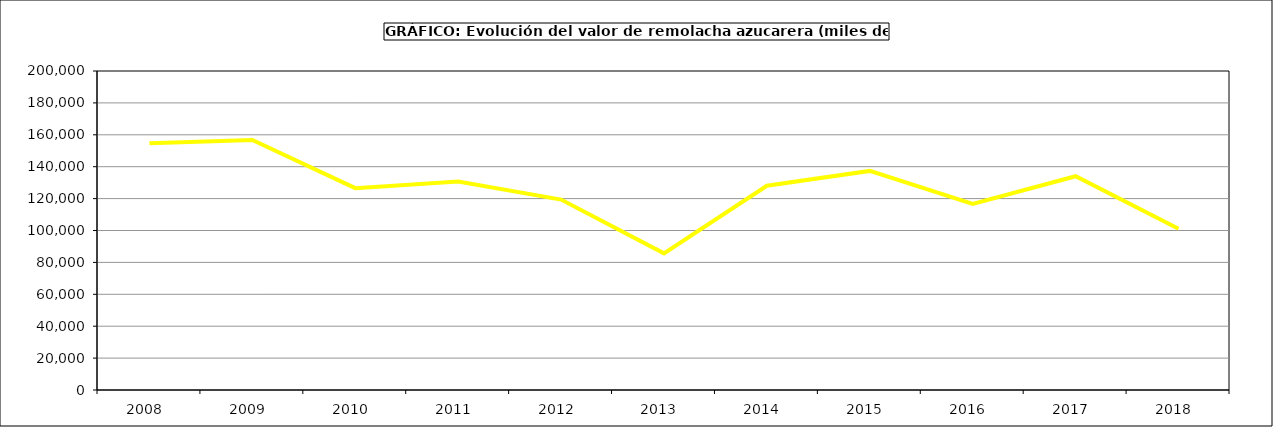
| Category | Valor |
|---|---|
| 2008.0 | 154723.398 |
| 2009.0 | 156763.564 |
| 2010.0 | 126535.709 |
| 2011.0 | 130682.292 |
| 2012.0 | 119377.935 |
| 2013.0 | 85662.388 |
| 2014.0 | 128081.83 |
| 2015.0 | 137355 |
| 2016.0 | 116654 |
| 2017.0 | 134014.925 |
| 2018.0 | 101055.926 |